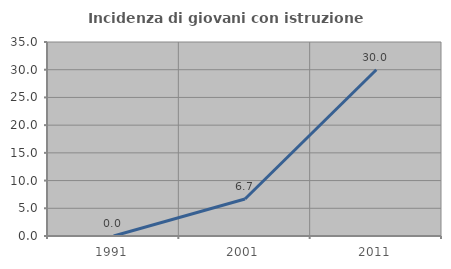
| Category | Incidenza di giovani con istruzione universitaria |
|---|---|
| 1991.0 | 0 |
| 2001.0 | 6.667 |
| 2011.0 | 30 |